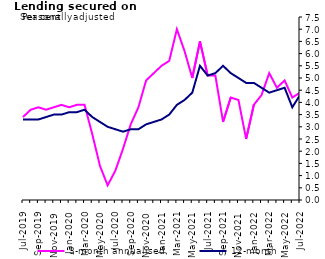
| Category | 3-month annualised | 12-month |
|---|---|---|
| Jul-2019 | 3.4 | 3.3 |
| Aug-2019 | 3.7 | 3.3 |
| Sep-2019 | 3.8 | 3.3 |
| Oct-2019 | 3.7 | 3.4 |
| Nov-2019 | 3.8 | 3.5 |
| Dec-2019 | 3.9 | 3.5 |
| Jan-2020 | 3.8 | 3.6 |
| Feb-2020 | 3.9 | 3.6 |
| Mar-2020 | 3.9 | 3.7 |
| Apr-2020 | 2.7 | 3.4 |
| May-2020 | 1.4 | 3.2 |
| Jun-2020 | 0.6 | 3 |
| Jul-2020 | 1.2 | 2.9 |
| Aug-2020 | 2.1 | 2.8 |
| Sep-2020 | 3.1 | 2.9 |
| Oct-2020 | 3.8 | 2.9 |
| Nov-2020 | 4.9 | 3.1 |
| Dec-2020 | 5.2 | 3.2 |
| Jan-2021 | 5.5 | 3.3 |
| Feb-2021 | 5.7 | 3.5 |
| Mar-2021 | 7 | 3.9 |
| Apr-2021 | 6.1 | 4.1 |
| May-2021 | 5 | 4.4 |
| Jun-2021 | 6.5 | 5.5 |
| Jul-2021 | 5.1 | 5.1 |
| Aug-2021 | 5.1 | 5.2 |
| Sep-2021 | 3.2 | 5.5 |
| Oct-2021 | 4.2 | 5.2 |
| Nov-2021 | 4.1 | 5 |
| Dec-2021 | 2.5 | 4.8 |
| Jan-2022 | 3.9 | 4.8 |
| Feb-2022 | 4.3 | 4.6 |
| Mar-2022 | 5.2 | 4.4 |
| Apr-2022 | 4.6 | 4.5 |
| May-2022 | 4.9 | 4.6 |
| Jun-2022 | 4.2 | 3.8 |
| Jul-2022 | 4.4 | 4.3 |